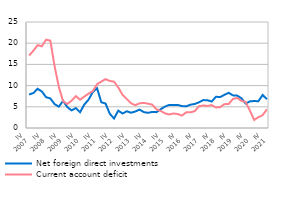
| Category | Net foreign direct investments | Current account deficit |
|---|---|---|
| IV
2007 | 7.896 | 17.094 |
| I | 8.243 | 18.228 |
| II | 9.246 | 19.543 |
| III | 8.607 | 19.284 |
| IV
2008 | 7.266 | 20.831 |
| I | 6.972 | 20.604 |
| II | 5.635 | 14.542 |
| III | 5.033 | 9.688 |
| IV
2009 | 6.4 | 6.289 |
| I | 4.923 | 5.655 |
| II | 4.154 | 6.435 |
| III | 4.695 | 7.516 |
| IV
2010 | 3.715 | 6.677 |
| I | 5.536 | 7.414 |
| II | 6.678 | 8.105 |
| III | 8.492 | 8.69 |
| IV
2011 | 9.38 | 10.33 |
| I | 6.069 | 10.953 |
| II | 5.774 | 11.525 |
| III | 3.353 | 11.095 |
| IV
2012 | 2.241 | 10.931 |
| I | 4.101 | 9.56 |
| II | 3.419 | 7.822 |
| III | 3.942 | 6.839 |
| IV
2013 | 3.601 | 5.821 |
| I | 3.886 | 5.386 |
| II | 4.337 | 5.809 |
| III | 3.756 | 5.933 |
| IV
2014 | 3.574 | 5.738 |
| I | 3.793 | 5.505 |
| II | 3.738 | 4.407 |
| III | 4.438 | 4.024 |
| IV
2015 | 5.052 | 3.455 |
| I | 5.445 | 3.193 |
| II | 5.431 | 3.417 |
| III | 5.433 | 3.297 |
| IV
2016 | 5.17 | 2.926 |
| I | 5.113 | 3.702 |
| II | 5.5 | 3.696 |
| III | 5.666 | 3.964 |
| IV
2017 | 6.05 | 5.131 |
| I | 6.579 | 5.304 |
| II | 6.56 | 5.203 |
| III | 6.231 | 5.4 |
| IV
2018 | 7.364 | 4.844 |
| I | 7.303 | 4.923 |
| II | 7.822 | 5.624 |
| III | 8.305 | 5.654 |
| IV
2019 | 7.698 | 6.852 |
| I | 7.649 | 7.095 |
| II | 7.018 | 6.405 |
| III | 5.761 | 6.141 |
| IV
2020 | 6.279 | 4.122 |
| I | 6.362 | 1.902 |
| II | 6.314 | 2.542 |
| III | 7.781 | 3.034 |
| IV
2021 | 6.8 | 4.395 |